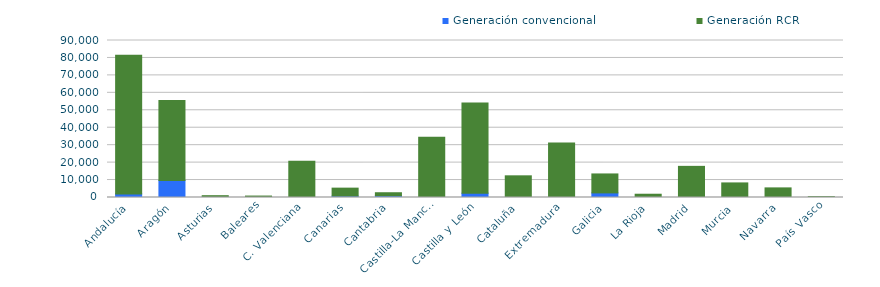
| Category | Generación convencional | Generación RCR |
|---|---|---|
| 0 | 2078 | 79411.124 |
| 1 | 9723 | 45868.266 |
| 2 | 220 | 816.5 |
| 3 | 113 | 717.535 |
| 4 | 30 | 20789.524 |
| 5 | 832 | 4535.183 |
| 6 | 994 | 1737.791 |
| 7 | 56 | 34509.818 |
| 8 | 2499 | 51609.937 |
| 9 | 0 | 12429.315 |
| 10 | 0 | 31310.432 |
| 11 | 2628 | 10879.319 |
| 12 | 0 | 1875.55 |
| 13 | 0 | 17853.3 |
| 14 | 53 | 8308.543 |
| 15 | 0 | 5507.926 |
| 16 | 20 | 469.797 |